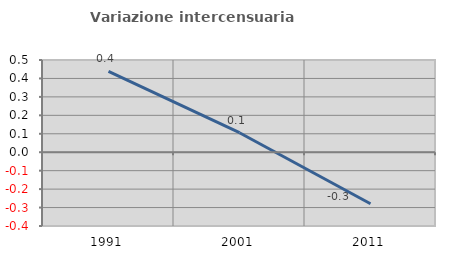
| Category | Variazione intercensuaria annua |
|---|---|
| 1991.0 | 0.438 |
| 2001.0 | 0.106 |
| 2011.0 | -0.279 |